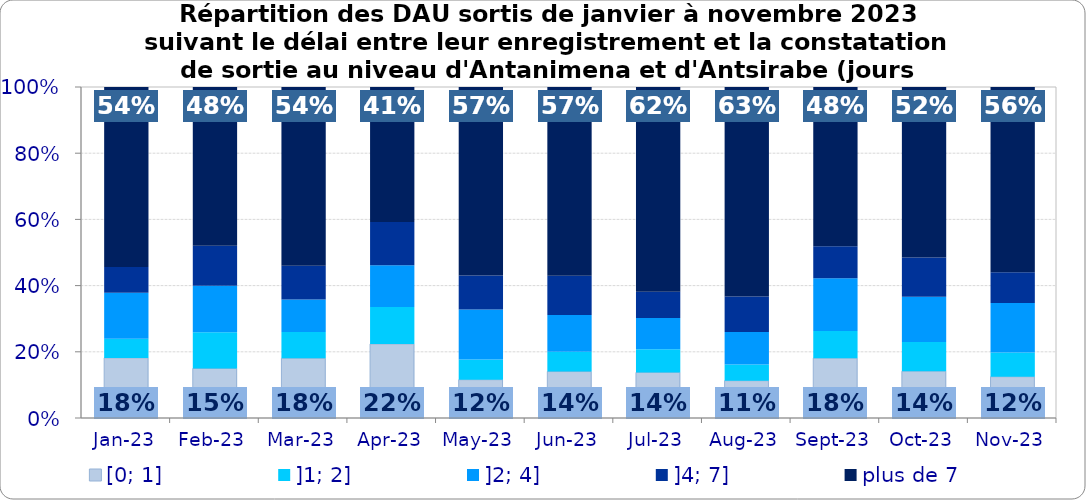
| Category | [0; 1] | ]1; 2] | ]2; 4] | ]4; 7] | plus de 7 |
|---|---|---|---|---|---|
| 2023-01-01 | 0.182 | 0.058 | 0.138 | 0.078 | 0.544 |
| 2023-02-01 | 0.15 | 0.11 | 0.141 | 0.121 | 0.479 |
| 2023-03-01 | 0.18 | 0.079 | 0.099 | 0.102 | 0.54 |
| 2023-04-01 | 0.224 | 0.112 | 0.126 | 0.13 | 0.408 |
| 2023-05-01 | 0.116 | 0.061 | 0.152 | 0.103 | 0.569 |
| 2023-06-01 | 0.14 | 0.06 | 0.111 | 0.119 | 0.57 |
| 2023-07-01 | 0.138 | 0.07 | 0.094 | 0.079 | 0.619 |
| 2023-08-01 | 0.113 | 0.049 | 0.099 | 0.107 | 0.633 |
| 2023-09-01 | 0.181 | 0.082 | 0.159 | 0.097 | 0.481 |
| 2023-10-01 | 0.141 | 0.088 | 0.137 | 0.118 | 0.515 |
| 2023-11-01 | 0.125 | 0.073 | 0.15 | 0.093 | 0.559 |